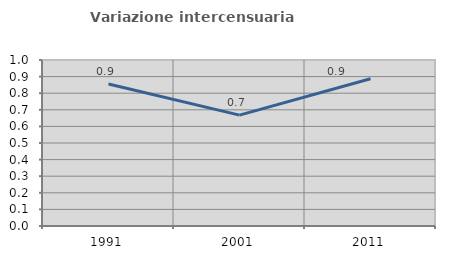
| Category | Variazione intercensuaria annua |
|---|---|
| 1991.0 | 0.856 |
| 2001.0 | 0.668 |
| 2011.0 | 0.887 |